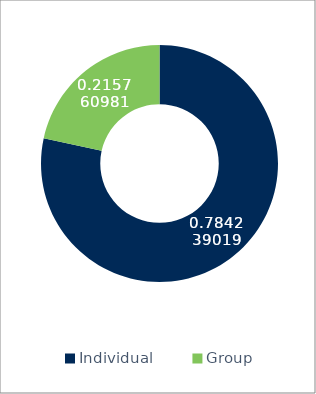
| Category | 2018 |
|---|---|
| Individual | 278438.844 |
| Group | 76604.5 |